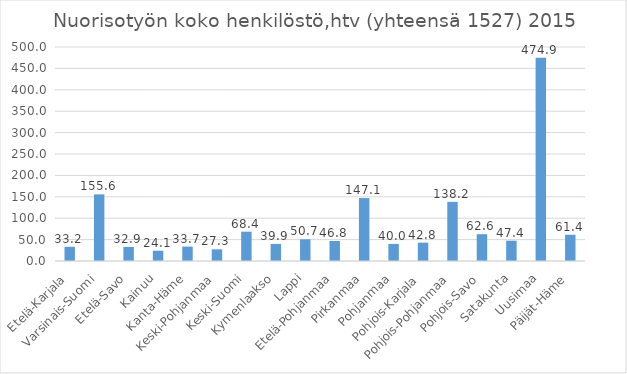
| Category | Nuorisotyön koko henkilöstö (htv) |
|---|---|
| Etelä-Karjala | 33.15 |
| Varsinais-Suomi | 155.63 |
| Etelä-Savo | 32.85 |
| Kainuu | 24.05 |
| Kanta-Häme | 33.65 |
| Keski-Pohjanmaa | 27.25 |
| Keski-Suomi | 68.42 |
| Kymenlaakso | 39.93 |
| Lappi | 50.71 |
| Etelä-Pohjanmaa | 46.8 |
| Pirkanmaa | 147.05 |
| Pohjanmaa | 39.95 |
| Pohjois-Karjala | 42.81 |
| Pohjois-Pohjanmaa | 138.15 |
| Pohjois-Savo | 62.6 |
| Satakunta | 47.44 |
| Uusimaa | 474.93 |
| Päijät-Häme | 61.35 |